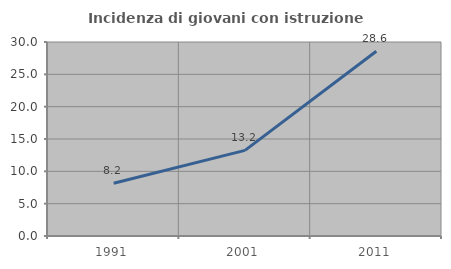
| Category | Incidenza di giovani con istruzione universitaria |
|---|---|
| 1991.0 | 8.163 |
| 2001.0 | 13.235 |
| 2011.0 | 28.571 |